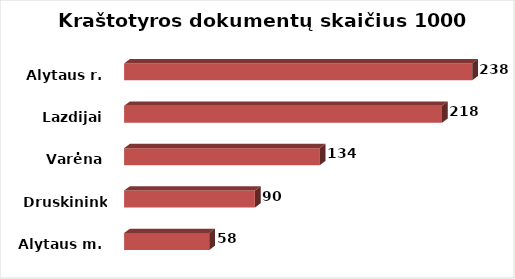
| Category | Series 0 |
|---|---|
| Alytaus m. | 58.309 |
| Druskininkai | 89.553 |
| Varėna | 134.002 |
| Lazdijai | 217.695 |
| Alytaus r. | 238.311 |